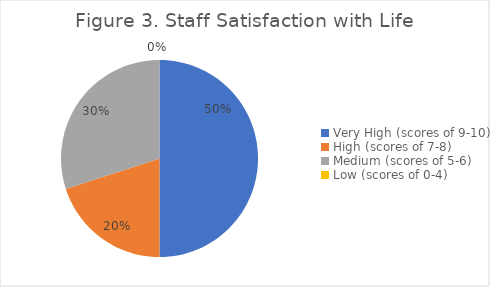
| Category | Series 0 |
|---|---|
| Very High (scores of 9-10) | 0.5 |
| High (scores of 7-8) | 0.2 |
| Medium (scores of 5-6) | 0.3 |
| Low (scores of 0-4) | 0 |